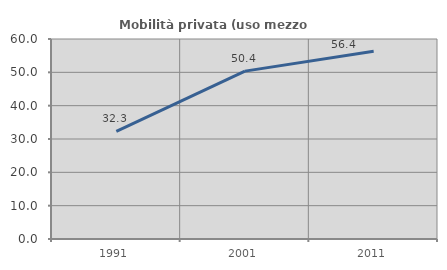
| Category | Mobilità privata (uso mezzo privato) |
|---|---|
| 1991.0 | 32.262 |
| 2001.0 | 50.367 |
| 2011.0 | 56.35 |